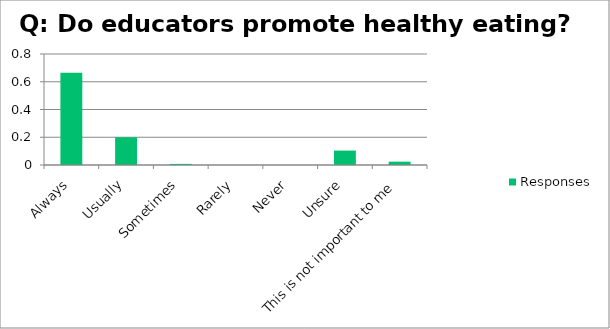
| Category | Responses |
|---|---|
| Always | 0.664 |
| Usually | 0.2 |
| Sometimes | 0.008 |
| Rarely | 0 |
| Never | 0 |
| Unsure | 0.104 |
| This is not important to me | 0.024 |